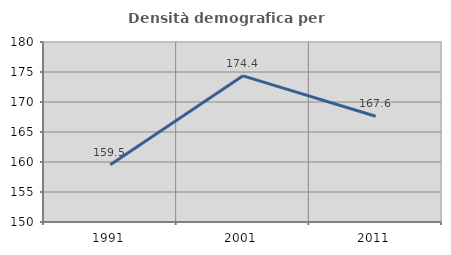
| Category | Densità demografica |
|---|---|
| 1991.0 | 159.537 |
| 2001.0 | 174.355 |
| 2011.0 | 167.619 |